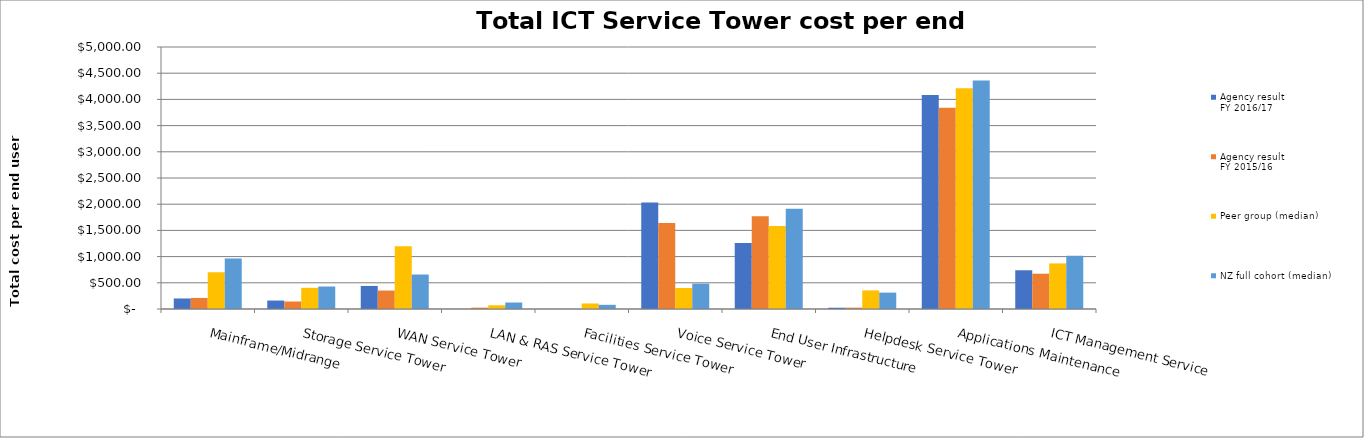
| Category | Agency result
FY 2016/17 | Agency result
FY 2015/16 | Peer group (median) | NZ full cohort (median) |
|---|---|---|---|---|
| Mainframe/Midrange | 200.888 | 211.017 | 701.147 | 964.224 |
| Storage Service Tower | 161.355 | 142.973 | 403.864 | 429.062 |
| WAN Service Tower | 440.097 | 352.369 | 1196.739 | 658.231 |
| LAN & RAS Service Tower | 0 | 25.516 | 71.099 | 123.766 |
| Facilities Service Tower | 0 | 0 | 105.627 | 79.764 |
| Voice Service Tower | 2033.481 | 1643.175 | 400.802 | 484.442 |
| End User Infrastructure | 1259.379 | 1769.137 | 1584.782 | 1914.978 |
| Helpdesk Service Tower | 24.203 | 25.516 | 354.661 | 312.572 |
| Applications Maintenance | 4082.291 | 3838.801 | 4212.934 | 4359.443 |
| ICT Management Service | 739.411 | 673.552 | 870.051 | 1017.479 |